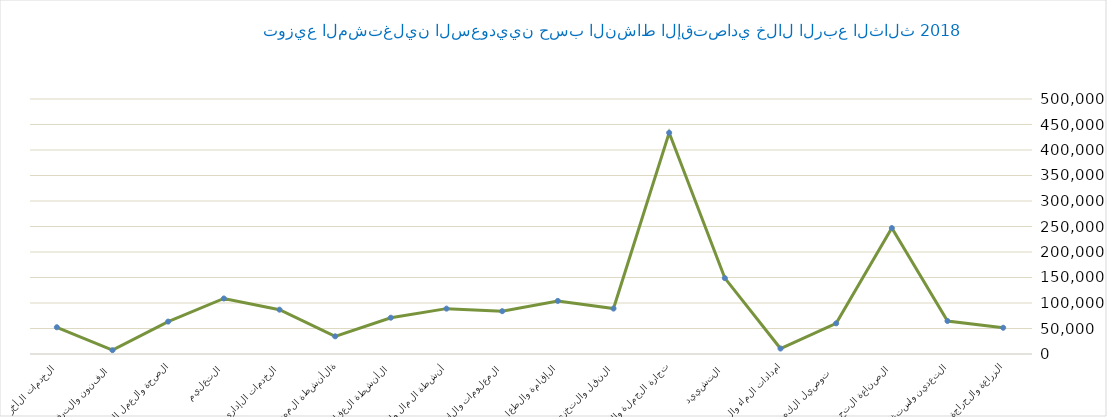
| Category | Series 0 |
|---|---|
| الزراعة والحراجة وصيد الأسماك | 51457 |
| التعدين واستغلال المحاجر | 64705 |
| الصناعة التحويلية | 246921 |
| توصيل الكهرباء والغاز  | 60132 |
| امدادات الماء والصرف الصحي | 10711 |
| التشييد | 148839 |
| تجارة الجملة والتجزئة | 433740 |
| النقل والتخزين | 89093 |
| الإقامة والطعام | 104091 |
| المعلومات والاتصالات | 83949 |
| أنشطة المال والتأمين | 88957 |
| الأنشطة العقارية | 71159 |
| الأنشطة المهنية  | 34653 |
| الخدمات الإدارية والدعم | 86930 |
| التعليم | 108854 |
| الصحة والعمل الاجتماعي | 63538 |
| الفنون والترفية | 7452 |
| الخدمات الأخرى | 52423 |